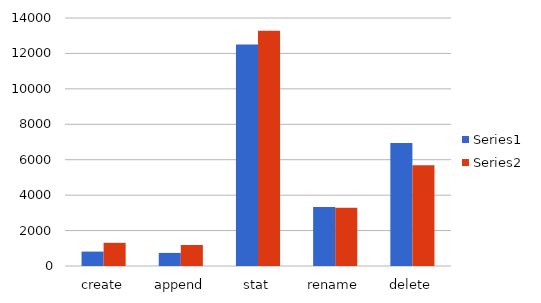
| Category | Series 0 | Series 1 |
|---|---|---|
| create | 814 | 1307 |
| append | 740 | 1187 |
| stat | 12504 | 13280 |
| rename | 3337 | 3288 |
| delete | 6937 | 5693 |